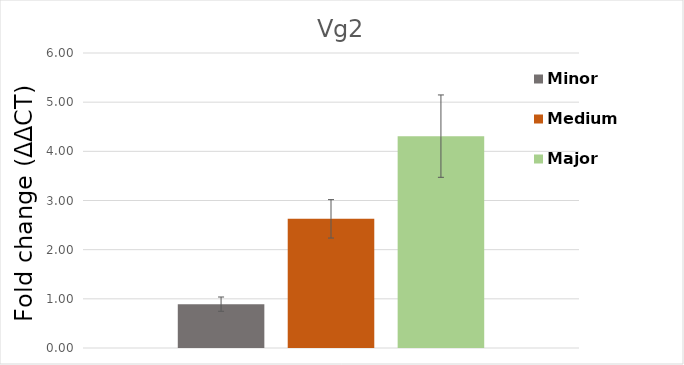
| Category | Minor | Medium | Major |
|---|---|---|---|
| Vg2 | 0.892 | 2.627 | 4.309 |